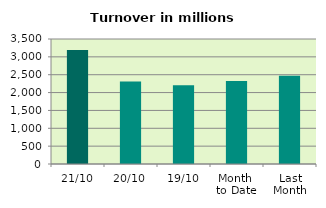
| Category | Series 0 |
|---|---|
| 21/10 | 3192.124 |
| 20/10 | 2309.564 |
| 19/10 | 2203.384 |
| Month 
to Date | 2326.793 |
| Last
Month | 2468.023 |